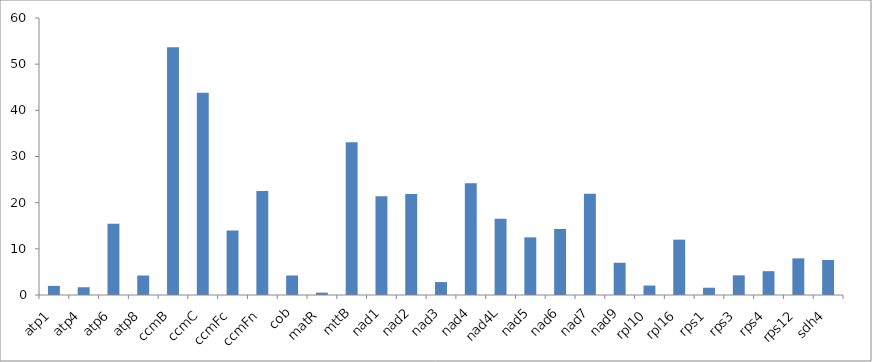
| Category | Density (sites/kb) |
|---|---|
| atp1 | 1.969 |
| atp4 | 1.675 |
| atp6 | 15.406 |
| atp8 | 4.219 |
| ccmB | 53.659 |
| ccmC | 43.825 |
| ccmFc | 13.95 |
| ccmFn | 22.53 |
| cob | 4.23 |
| matR | 0.514 |
| mttB | 33.079 |
| nad1 | 21.396 |
| nad2 | 21.903 |
| nad3 | 2.801 |
| nad4 | 24.194 |
| nad4L | 16.502 |
| nad5 | 12.494 |
| nad6 | 14.286 |
| nad7 | 21.941 |
| nad9 | 6.981 |
| rpl10 | 2.045 |
| rpl16 | 11.99 |
| rps1 | 1.572 |
| rps3 | 4.258 |
| rps4 | 5.16 |
| rps12 | 7.937 |
| sdh4 | 7.576 |